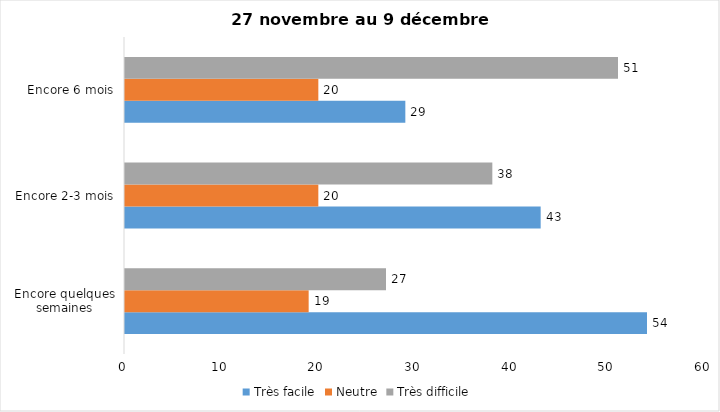
| Category | Très facile | Neutre | Très difficile |
|---|---|---|---|
| Encore quelques semaines | 54 | 19 | 27 |
| Encore 2-3 mois | 43 | 20 | 38 |
| Encore 6 mois | 29 | 20 | 51 |